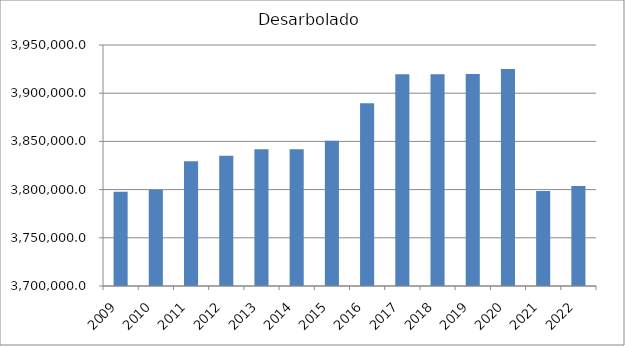
| Category | Desarbolado |
|---|---|
| 2009.0 | 3797734.083 |
| 2010.0 | 3799735.187 |
| 2011.0 | 3829480.959 |
| 2012.0 | 3835114.569 |
| 2013.0 | 3841745.809 |
| 2014.0 | 3841745.809 |
| 2015.0 | 3850550.33 |
| 2016.0 | 3889595.24 |
| 2017.0 | 3919565.404 |
| 2018.0 | 3919589.683 |
| 2019.0 | 3919812.732 |
| 2020.0 | 3925139.359 |
| 2021.0 | 3798538.376 |
| 2022.0 | 3803819.059 |